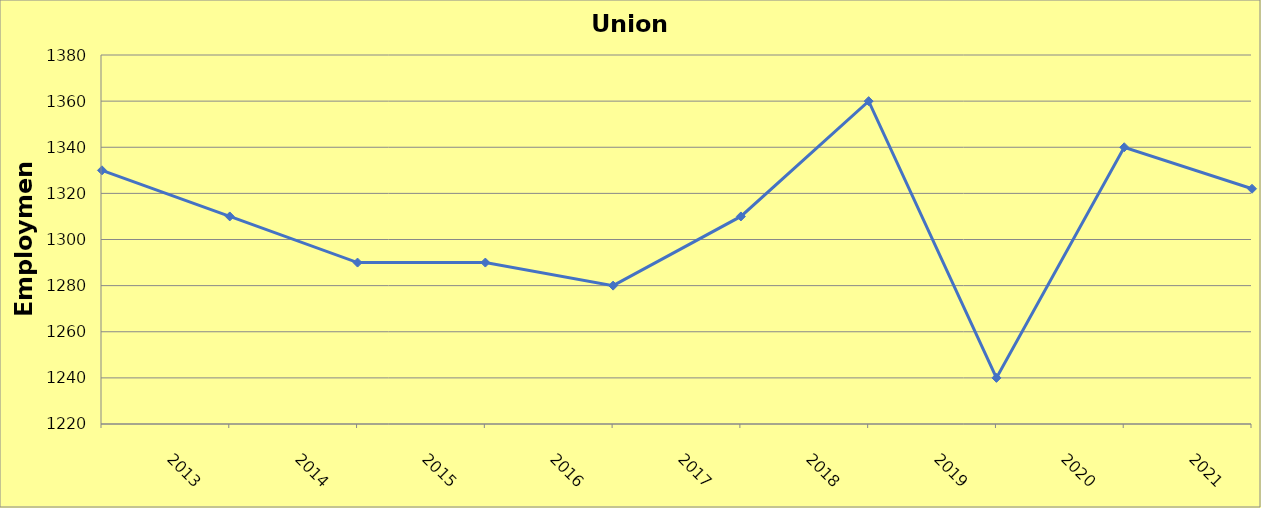
| Category | Union County |
|---|---|
| 2013.0 | 1330 |
| 2014.0 | 1310 |
| 2015.0 | 1290 |
| 2016.0 | 1290 |
| 2017.0 | 1280 |
| 2018.0 | 1310 |
| 2019.0 | 1360 |
| 2020.0 | 1240 |
| 2021.0 | 1340 |
| 2022.0 | 1322 |